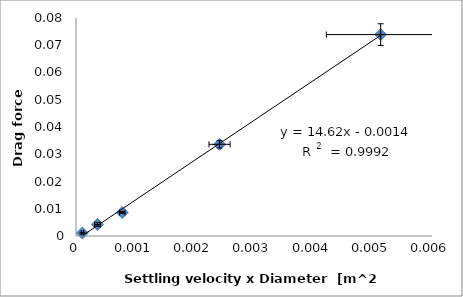
| Category | Series 0 |
|---|---|
| 0.005135 | 0.074 |
| 0.00242 | 0.034 |
| 0.000779145 | 0.009 |
| 0.000361 | 0.004 |
| 0.00010812 | 0.001 |